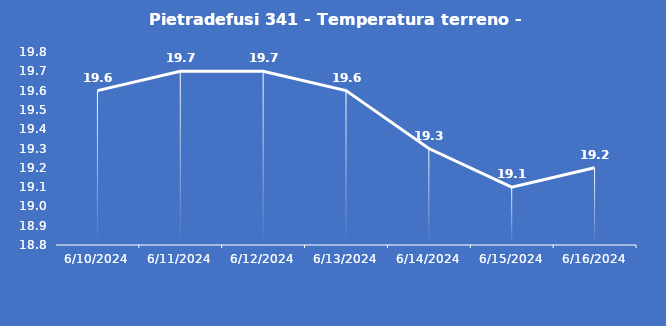
| Category | Pietradefusi 341 - Temperatura terreno - Grezzo (°C) |
|---|---|
| 6/10/24 | 19.6 |
| 6/11/24 | 19.7 |
| 6/12/24 | 19.7 |
| 6/13/24 | 19.6 |
| 6/14/24 | 19.3 |
| 6/15/24 | 19.1 |
| 6/16/24 | 19.2 |